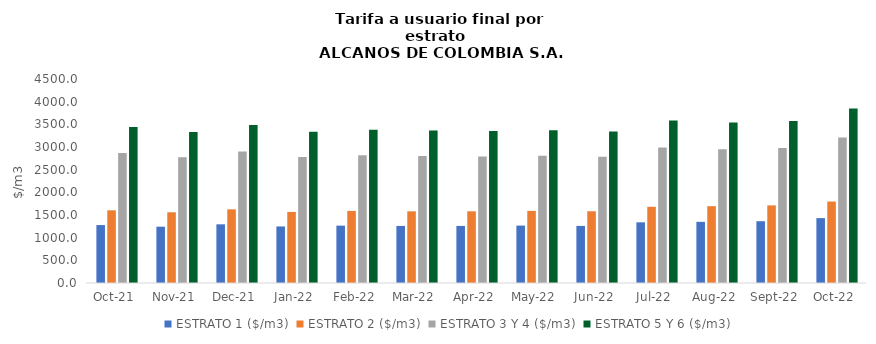
| Category | ESTRATO 1 ($/m3) | ESTRATO 2 ($/m3) | ESTRATO 3 Y 4 ($/m3) | ESTRATO 5 Y 6 ($/m3) |
|---|---|---|---|---|
| 2021-10-01 | 1277.86 | 1603.04 | 2868 | 3441.6 |
| 2021-11-01 | 1242.16 | 1560.17 | 2775.81 | 3330.972 |
| 2021-12-01 | 1294.42 | 1624.99 | 2902.39 | 3482.868 |
| 2022-01-01 | 1247.63 | 1567.63 | 2778.76 | 3334.512 |
| 2022-02-01 | 1265.36 | 1589.21 | 2818.77 | 3382.524 |
| 2022-03-01 | 1258.99 | 1581.08 | 2801.57 | 3361.884 |
| 2022-04-01 | 1258.78 | 1581.81 | 2791.83 | 3350.196 |
| 2022-05-01 | 1266.29 | 1591.45 | 2808.77 | 3370.524 |
| 2022-06-01 | 1259.34 | 1582.32 | 2787.21 | 3344.652 |
| 2022-07-01 | 1338.24 | 1681.01 | 2986.65 | 3583.98 |
| 2022-08-01 | 1348.94 | 1694.58 | 2951.9 | 3542.28 |
| 2022-09-01 | 1362.74 | 1711.93 | 2979.32 | 3575.184 |
| 2022-10-01 | 1431.37 | 1796.98 | 3208.12 | 3849.744 |